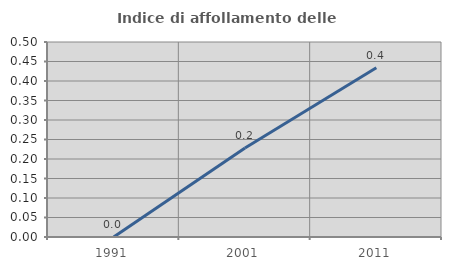
| Category | Indice di affollamento delle abitazioni  |
|---|---|
| 1991.0 | 0 |
| 2001.0 | 0.228 |
| 2011.0 | 0.434 |